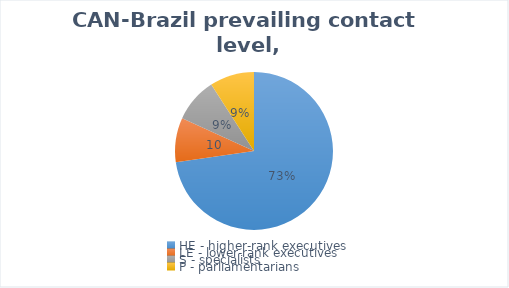
| Category | 2005-2015 |
|---|---|
| HE - higher-rank executives | 8 |
| LE - lower-rank executives | 1 |
| S - specialists | 1 |
| P - parliamentarians | 1 |